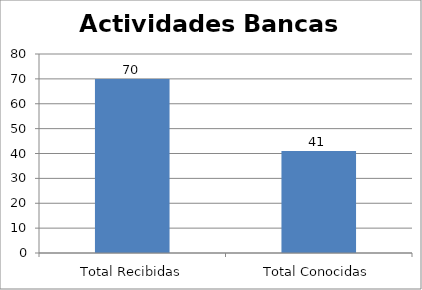
| Category | Series 0 |
|---|---|
| Total Recibidas | 70 |
| Total Conocidas | 41 |